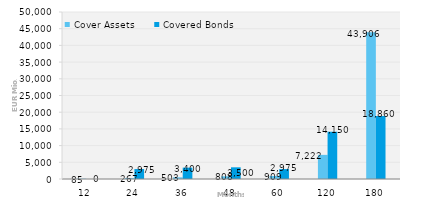
| Category | Cover Assets | Covered Bonds |
|---|---|---|
| 12.0 | 85.198 | 0 |
| 24.0 | 266.961 | 2975 |
| 36.0 | 502.848 | 3400 |
| 48.0 | 807.654 | 3500 |
| 60.0 | 908.743 | 2975 |
| 120.0 | 7222.22 | 14150 |
| 180.0 | 43905.947 | 18860 |